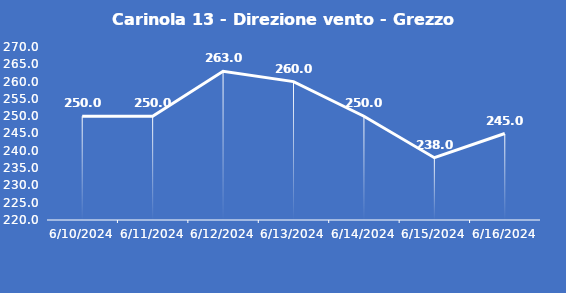
| Category | Carinola 13 - Direzione vento - Grezzo (°N) |
|---|---|
| 6/10/24 | 250 |
| 6/11/24 | 250 |
| 6/12/24 | 263 |
| 6/13/24 | 260 |
| 6/14/24 | 250 |
| 6/15/24 | 238 |
| 6/16/24 | 245 |